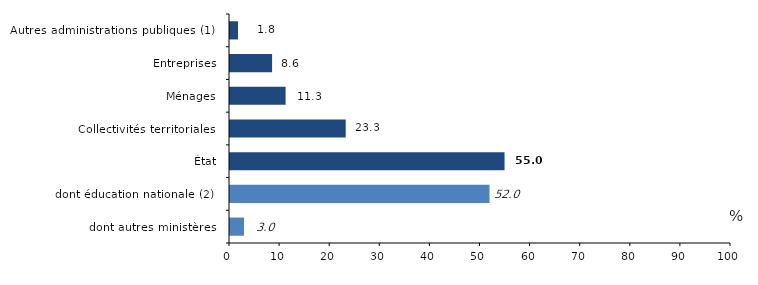
| Category | Series 0 |
|---|---|
| dont autres ministères | 3 |
| dont éducation nationale (2) | 52 |
| État | 55 |
| Collectivités territoriales | 23.3 |
| Ménages | 11.3 |
|  Entreprises | 8.6 |
| Autres administrations publiques (1) | 1.8 |